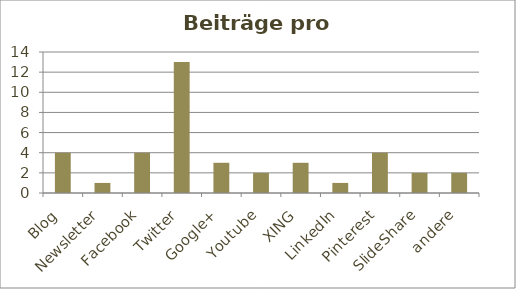
| Category | Beiträge |
|---|---|
| Blog | 4 |
| Newsletter | 1 |
| Facebook | 4 |
| Twitter | 13 |
| Google+ | 3 |
| Youtube | 2 |
| XING | 3 |
| LinkedIn | 1 |
| Pinterest | 4 |
| SlideShare | 2 |
| andere | 2 |